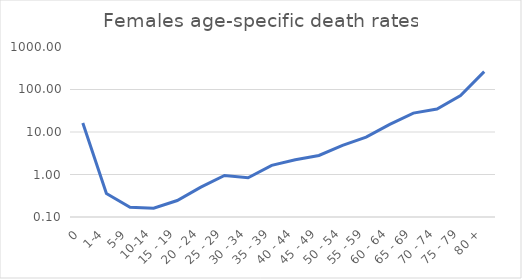
| Category | Series 0 |
|---|---|
| 0 | 16.334 |
| 1-4 | 0.358 |
| 5-9 | 0.17 |
| 10-14 | 0.161 |
| 15 - 19 | 0.244 |
| 20 - 24 | 0.503 |
| 25 - 29 | 0.949 |
| 30 - 34 | 0.837 |
| 35 - 39 | 1.638 |
| 40 - 44 | 2.232 |
| 45 - 49 | 2.805 |
| 50 - 54 | 4.839 |
| 55 - 59 | 7.549 |
| 60 - 64 | 15.149 |
| 65 - 69 | 27.812 |
| 70 - 74 | 34.75 |
| 75 - 79 | 72.49 |
| 80 + | 263.268 |